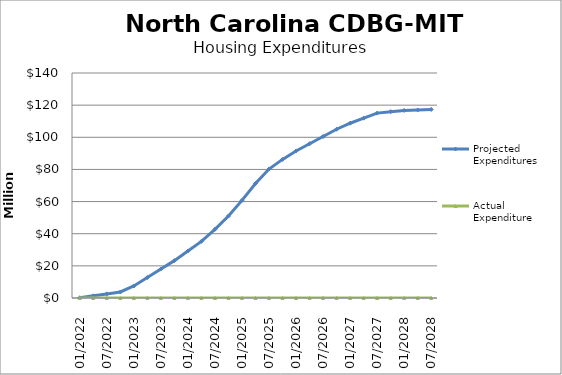
| Category | Projected Expenditures | Actual Expenditure |
|---|---|---|
| 01/2022 | 150000 | 0 |
| 04/2022 | 1350000 | 0 |
| 07/2022 | 2550000 | 0 |
| 10/2022 | 3750000 | 0 |
| 01/2023 | 7500000 | 0 |
| 04/2023 | 12750000 | 0 |
| 07/2023 | 18000000 | 0 |
| 10/2023 | 23250000 | 0 |
| 01/2024 | 29250000 | 0 |
| 04/2024 | 35250000 | 0 |
| 07/2024 | 42750000 | 0 |
| 10/2024 | 51000000 | 0 |
| 01/2025 | 60750000 | 0 |
| 04/2025 | 71250000 | 0 |
| 07/2025 | 80250000 | 0 |
| 10/2025 | 86250000 | 0 |
| 01/2026 | 91500000 | 0 |
| 04/2026 | 96000000 | 0 |
| 07/2026 | 100500000 | 0 |
| 10/2026 | 105000000 | 0 |
| 01/2027 | 108750000 | 0 |
| 04/2027 | 111900000 | 0 |
| 07/2027 | 115050000 | 0 |
| 10/2027 | 115950000 | 0 |
| 01/2028 | 116700000 | 0 |
| 04/2028 | 117000000 | 0 |
| 07/2028 | 117300000 | 0 |